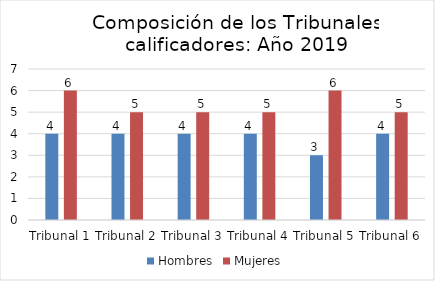
| Category | Hombres | Mujeres |
|---|---|---|
| Tribunal 1 | 4 | 6 |
| Tribunal 2 | 4 | 5 |
| Tribunal 3 | 4 | 5 |
| Tribunal 4 | 4 | 5 |
| Tribunal 5 | 3 | 6 |
| Tribunal 6 | 4 | 5 |